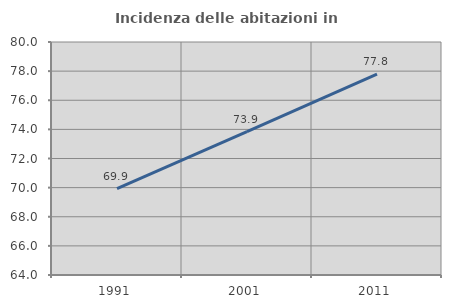
| Category | Incidenza delle abitazioni in proprietà  |
|---|---|
| 1991.0 | 69.931 |
| 2001.0 | 73.854 |
| 2011.0 | 77.797 |